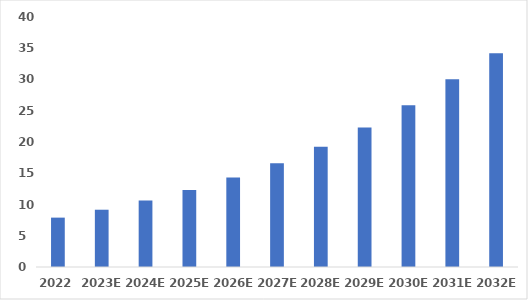
| Category | Series 0 |
|---|---|
| 2022 | 7.9 |
| 2023E | 9.164 |
| 2024E | 10.63 |
| 2025E | 12.331 |
| 2026E | 14.304 |
| 2027E | 16.593 |
| 2028E | 19.248 |
| 2029E | 22.327 |
| 2030E | 25.899 |
| 2031E | 30.043 |
| 2032E | 34.2 |